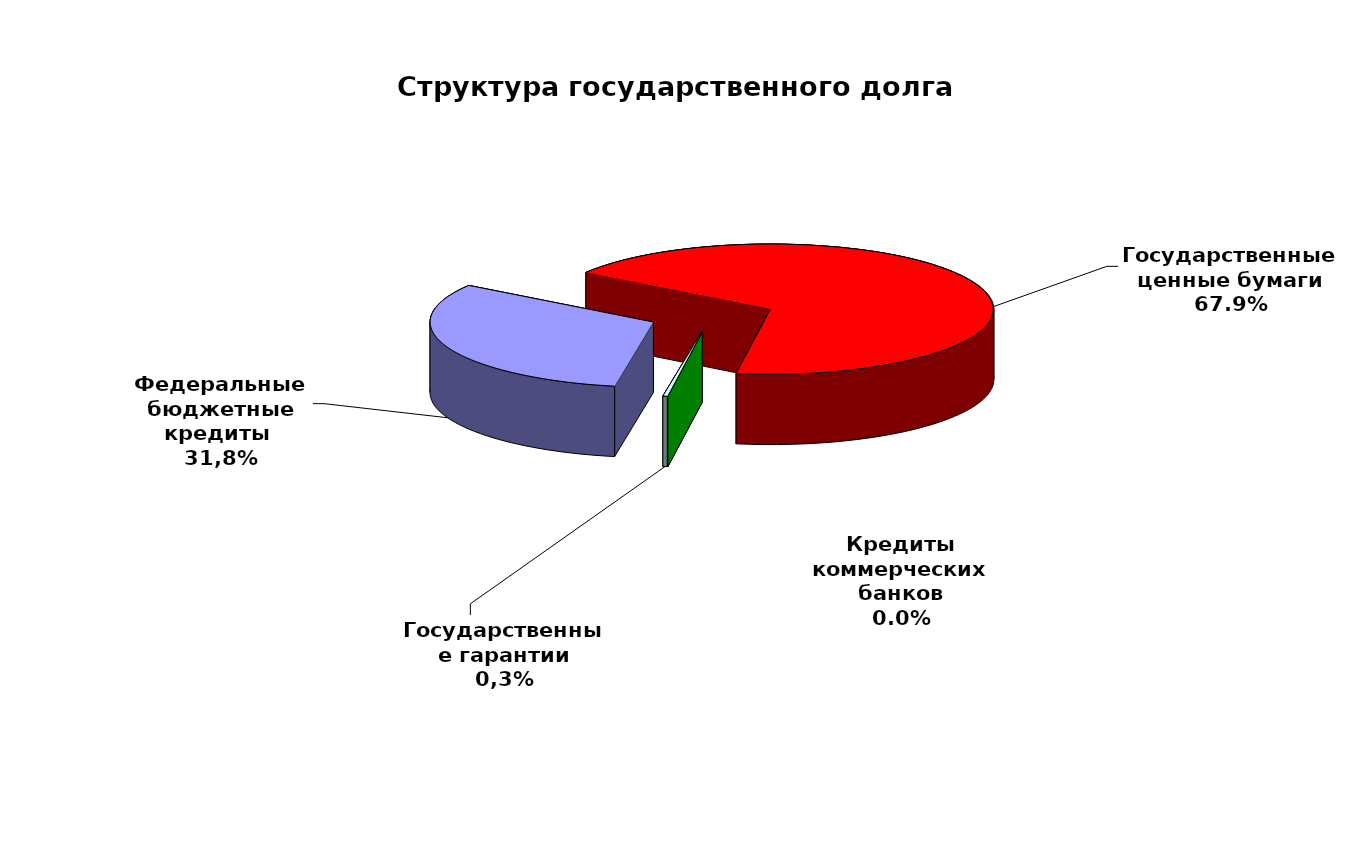
| Category | Series 0 |
|---|---|
| Федеральные бюджетные кредиты  | 19957026.213 |
| Государственные ценные бумаги | 42700000 |
| Кредиты коммерческих банков | 0 |
| Государственные гарантии | 200735.9 |